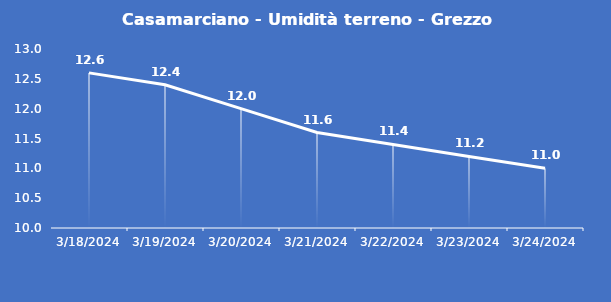
| Category | Casamarciano - Umidità terreno - Grezzo (%VWC) |
|---|---|
| 3/18/24 | 12.6 |
| 3/19/24 | 12.4 |
| 3/20/24 | 12 |
| 3/21/24 | 11.6 |
| 3/22/24 | 11.4 |
| 3/23/24 | 11.2 |
| 3/24/24 | 11 |